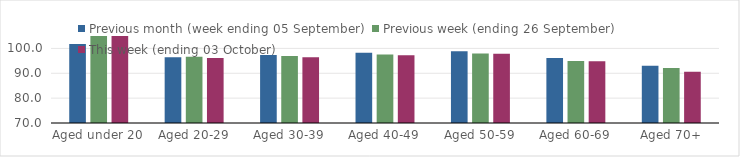
| Category | Previous month (week ending 05 September) | Previous week (ending 26 September) | This week (ending 03 October) |
|---|---|---|---|
| Aged under 20 | 101.79 | 104.96 | 105.36 |
| Aged 20-29 | 96.45 | 96.62 | 96.18 |
| Aged 30-39 | 97.37 | 96.91 | 96.48 |
| Aged 40-49 | 98.28 | 97.57 | 97.28 |
| Aged 50-59 | 98.86 | 97.95 | 97.81 |
| Aged 60-69 | 96.11 | 94.93 | 94.83 |
| Aged 70+ | 93.03 | 92.13 | 90.59 |